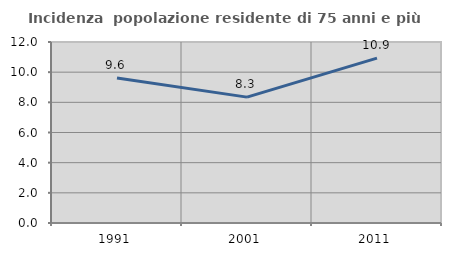
| Category | Incidenza  popolazione residente di 75 anni e più |
|---|---|
| 1991.0 | 9.618 |
| 2001.0 | 8.346 |
| 2011.0 | 10.931 |